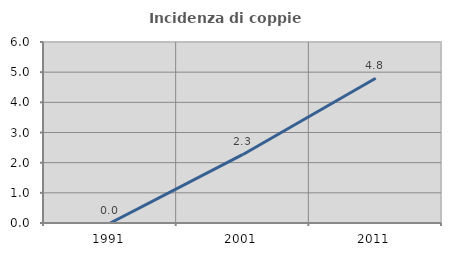
| Category | Incidenza di coppie miste |
|---|---|
| 1991.0 | 0 |
| 2001.0 | 2.273 |
| 2011.0 | 4.8 |